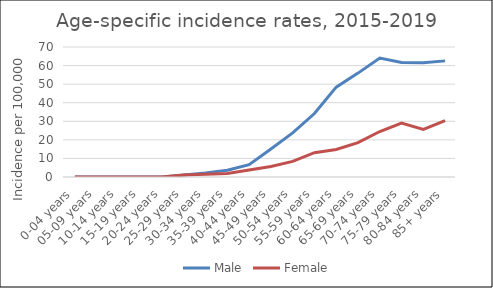
| Category | Male | Female |
|---|---|---|
| 0-04 years | 0 | 0 |
| 05-09 years | 0 | 0 |
| 10-14 years | 0 | 0 |
| 15-19 years | 0 | 0 |
| 20-24 years | 0 | 0 |
| 25-29 years | 1.12 | 1.07 |
| 30-34 years | 2.22 | 1.46 |
| 35-39 years | 3.65 | 1.93 |
| 40-44 years | 6.64 | 3.75 |
| 45-49 years | 15.07 | 5.68 |
| 50-54 years | 23.78 | 8.43 |
| 55-59 years | 34.18 | 13.07 |
| 60-64 years | 48.38 | 14.85 |
| 65-69 years | 55.94 | 18.48 |
| 70-74 years | 64.03 | 24.48 |
| 75-79 years | 61.61 | 29.06 |
| 80-84 years | 61.5 | 25.62 |
| 85+ years | 62.53 | 30.39 |